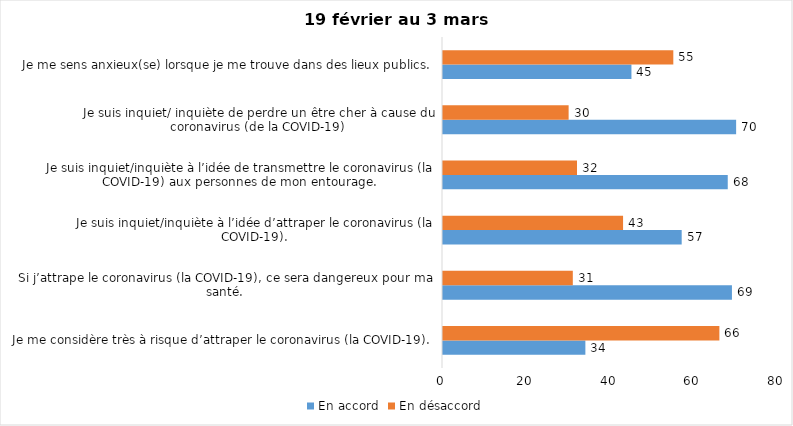
| Category | En accord | En désaccord |
|---|---|---|
| Je me considère très à risque d’attraper le coronavirus (la COVID-19). | 34 | 66 |
| Si j’attrape le coronavirus (la COVID-19), ce sera dangereux pour ma santé. | 69 | 31 |
| Je suis inquiet/inquiète à l’idée d’attraper le coronavirus (la COVID-19). | 57 | 43 |
| Je suis inquiet/inquiète à l’idée de transmettre le coronavirus (la COVID-19) aux personnes de mon entourage. | 68 | 32 |
| Je suis inquiet/ inquiète de perdre un être cher à cause du coronavirus (de la COVID-19) | 70 | 30 |
| Je me sens anxieux(se) lorsque je me trouve dans des lieux publics. | 45 | 55 |